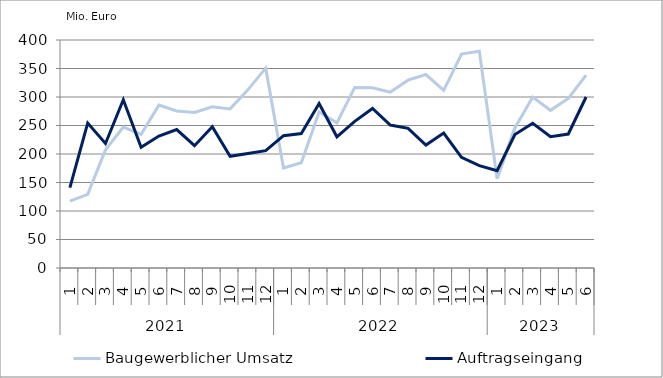
| Category | Baugewerblicher Umsatz | Auftragseingang |
|---|---|---|
| 0 | 117421.805 | 141020.655 |
| 1 | 129162.55 | 254416.876 |
| 2 | 207280.837 | 218451.405 |
| 3 | 247094.279 | 295077.868 |
| 4 | 234515.312 | 211696.129 |
| 5 | 285732.845 | 231455.155 |
| 6 | 275480.885 | 242932.505 |
| 7 | 272787.524 | 214636.944 |
| 8 | 282850.254 | 247827.991 |
| 9 | 279173.21 | 196069.238 |
| 10 | 312511.437 | 201015.897 |
| 11 | 350582.01 | 205949.991 |
| 12 | 175456.852 | 232178.255 |
| 13 | 184578.32 | 236006.862 |
| 14 | 273732.567 | 288451.109 |
| 15 | 254683.671 | 230228.968 |
| 16 | 316794.568 | 257235.39 |
| 17 | 316277.567 | 279900.179 |
| 18 | 308621.034 | 250827.343 |
| 19 | 329490.411 | 244949.341 |
| 20 | 339435.208 | 215809.075 |
| 21 | 311599.811 | 236674.056 |
| 22 | 375203.994 | 194107.214 |
| 23 | 380445.583 | 179631.624 |
| 24 | 156885.157 | 170764.939 |
| 25 | 245647.016 | 234064.391 |
| 26 | 299793.904 | 253873.168 |
| 27 | 276653.498 | 230304.701 |
| 28 | 297513.239 | 235047.978 |
| 29 | 338296.53 | 299989.264 |